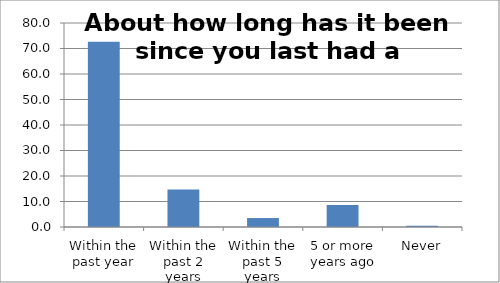
| Category | Series 0 |
|---|---|
| Within the past year | 72.655 |
| Within the past 2 years | 14.73 |
| Within the past 5 years | 3.513 |
| 5 or more years ago | 8.588 |
| Never | 0.515 |